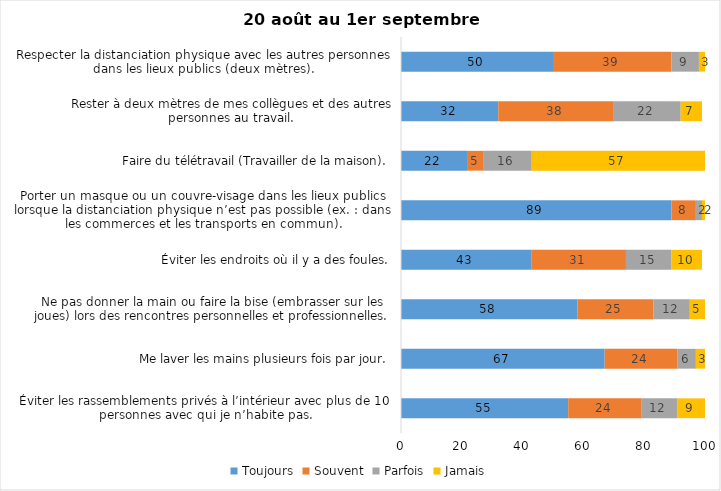
| Category | Toujours | Souvent | Parfois | Jamais |
|---|---|---|---|---|
| Éviter les rassemblements privés à l’intérieur avec plus de 10 personnes avec qui je n’habite pas. | 55 | 24 | 12 | 9 |
| Me laver les mains plusieurs fois par jour. | 67 | 24 | 6 | 3 |
| Ne pas donner la main ou faire la bise (embrasser sur les joues) lors des rencontres personnelles et professionnelles. | 58 | 25 | 12 | 5 |
| Éviter les endroits où il y a des foules. | 43 | 31 | 15 | 10 |
| Porter un masque ou un couvre-visage dans les lieux publics lorsque la distanciation physique n’est pas possible (ex. : dans les commerces et les transports en commun). | 89 | 8 | 2 | 2 |
| Faire du télétravail (Travailler de la maison). | 22 | 5 | 16 | 57 |
| Rester à deux mètres de mes collègues et des autres personnes au travail. | 32 | 38 | 22 | 7 |
| Respecter la distanciation physique avec les autres personnes dans les lieux publics (deux mètres). | 50 | 39 | 9 | 3 |